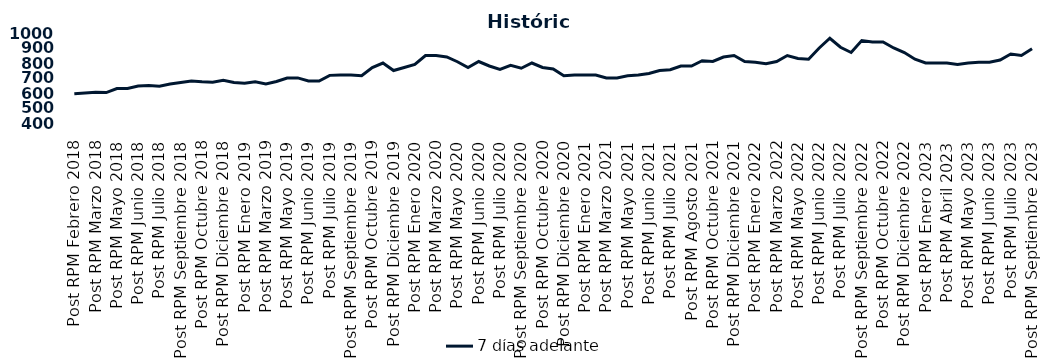
| Category | 7 días adelante  |
|---|---|
| Post RPM Febrero 2018 | 595 |
| Pre RPM Marzo 2018 | 600 |
| Post RPM Marzo 2018 | 605 |
| Pre RPM Mayo 2018 | 603 |
| Post RPM Mayo 2018 | 630 |
| Pre RPM Junio 2018 | 630 |
| Post RPM Junio 2018 | 646.5 |
| Pre RPM Julio 2018 | 650 |
| Post RPM Julio 2018 | 645 |
| Pre RPM Septiembre 2018 | 660 |
| Post RPM Septiembre 2018 | 670 |
| Pre RPM Octubre 2018 | 680 |
| Post RPM Octubre 2018 | 675 |
| Pre RPM Diciembre 2018 | 672.5 |
| Post RPM Diciembre 2018 | 685 |
| Pre RPM Enero 2019 | 670 |
| Post RPM Enero 2019 | 665 |
| Pre RPM Marzo 2019 | 675 |
| Post RPM Marzo 2019 | 661 |
| Pre RPM Mayo 2019 | 677 |
| Post RPM Mayo 2019 | 700 |
| Pre RPM Junio 2019 | 700.5 |
| Post RPM Junio 2019 | 680 |
| Pre RPM Julio 2019 | 680 |
| Post RPM Julio 2019 | 717.5 |
| Pre RPM Septiembre 2019 | 720 |
| Post RPM Septiembre 2019 | 720 |
| Pre RPM Octubre 2019 | 715 |
| Post RPM Octubre 2019 | 770 |
| Pre RPM Diciembre 2019 | 800 |
| Post RPM Diciembre 2019 | 750 |
| Pre RPM Enero 2020 | 770 |
| Post RPM Enero 2020 | 790 |
| Pre RPM Marzo 2020 | 850 |
| Post RPM Marzo 2020 | 850 |
| Pre RPM Mayo 2020 | 840 |
| Post RPM Mayo 2020 | 808.5 |
| Pre RPM Junio 2020 | 770 |
| Post RPM Junio 2020 | 810 |
| Pre RPM Julio 2020 | 780 |
| Post RPM Julio 2020 | 757 |
| Pre RPM Septiembre 2020 | 785 |
| Post RPM Septiembre 2020 | 765 |
| Pre RPM Octubre 2020 | 800 |
| Post RPM Octubre 2020 | 770 |
| Pre RPM Diciembre 2020 | 760 |
| Post RPM Diciembre 2020 | 715 |
| Pre RPM Enero 2021 | 720 |
| Post RPM Enero 2021 | 720 |
| Pre RPM Marzo 2021 | 720 |
| Post RPM Marzo 2021 | 700 |
| Pre RPM Mayo 2021 | 700 |
| Post RPM Mayo 2021 | 715 |
| Pre RPM Junio 2021 | 720 |
| Post RPM Junio 2021 | 730 |
| Pre RPM Julio 2021 | 750 |
| Post RPM Julio 2021 | 755 |
| Pre RPM Agosto 2021 | 780 |
| Post RPM Agosto 2021 | 780 |
| Pre RPM Octubre 2021 | 815 |
| Post RPM Octubre 2021 | 810 |
| Pre RPM Diciembre 2021 | 840 |
| Post RPM Diciembre 2021 | 850 |
| Pre RPM Enero 2022 | 810 |
| Post RPM Enero 2022 | 805 |
| Pre RPM Marzo 2022 | 795 |
| Post RPM Marzo 2022 | 810 |
| Pre RPM Mayo 2022 | 850 |
| Post RPM Mayo 2022 | 830 |
| Pre RPM Junio 2022 | 825 |
| Post RPM Junio 2022 | 900 |
| Pre RPM Julio 2022 | 965 |
| Post RPM Julio 2022 | 905 |
| Pre RPM Septiembre 2022 | 870 |
| Post RPM Septiembre 2022 | 950 |
| Pre RPM Octubre 2022 | 940 |
| Post RPM Octubre 2022 | 940 |
| Pre RPM Diciembre 2022 | 900 |
| Post RPM Diciembre 2022 | 870 |
| Pre RPM Enero 2023 | 825 |
| Post RPM Enero 2023 | 800 |
| Pre RPM Abril 2023 | 800 |
| Post RPM Abril 2023 | 800 |
| Pre RPM Mayo 2023 | 790 |
| Post RPM Mayo 2023 | 800 |
| Pre RPM Junio 2023 | 805 |
| Post RPM Junio 2023 | 805 |
| Pre RPM Julio 2023 | 820 |
| Post RPM Julio 2023 | 860 |
| Pre RPM Septiembre 2023 | 850 |
| Post RPM Septiembre 2023 | 895 |